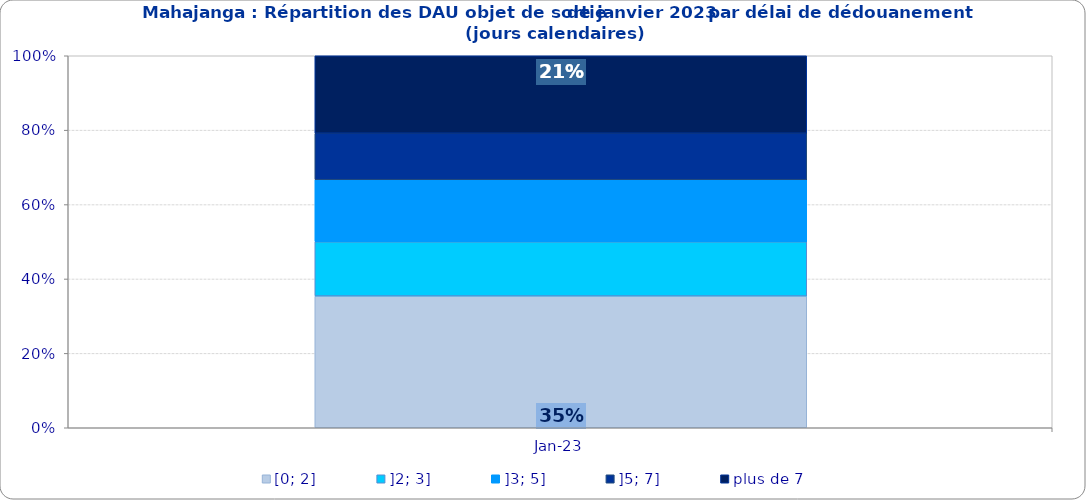
| Category | [0; 2] | ]2; 3] | ]3; 5] | ]5; 7] | plus de 7 |
|---|---|---|---|---|---|
| 2023-01-01 | 0.354 | 0.146 | 0.167 | 0.125 | 0.208 |